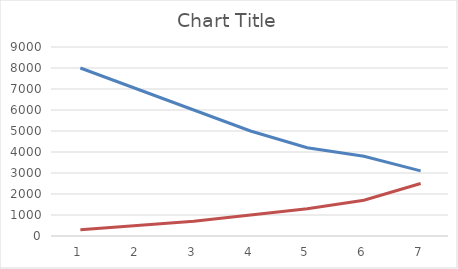
| Category | VR | Operacoes |
|---|---|---|
| 0 | 8000 | 300 |
| 1 | 7000 | 500 |
| 2 | 6000 | 700 |
| 3 | 5000 | 1000 |
| 4 | 4200 | 1300 |
| 5 | 3800 | 1700 |
| 6 | 3100 | 2500 |